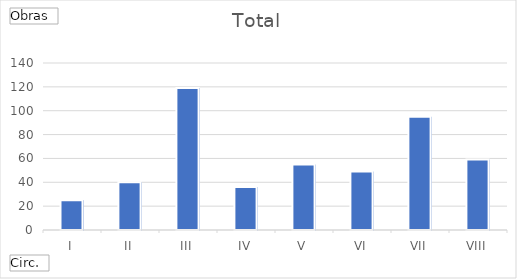
| Category | Total |
|---|---|
| I | 25 |
| II | 40 |
| III | 119 |
| IV | 36 |
| V | 55 |
| VI | 49 |
| VII | 95 |
| VIII | 59 |